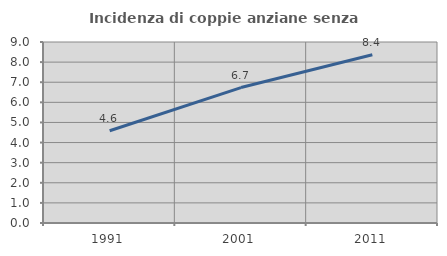
| Category | Incidenza di coppie anziane senza figli  |
|---|---|
| 1991.0 | 4.585 |
| 2001.0 | 6.735 |
| 2011.0 | 8.367 |